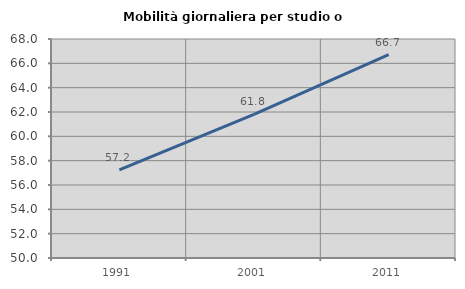
| Category | Mobilità giornaliera per studio o lavoro |
|---|---|
| 1991.0 | 57.248 |
| 2001.0 | 61.798 |
| 2011.0 | 66.718 |